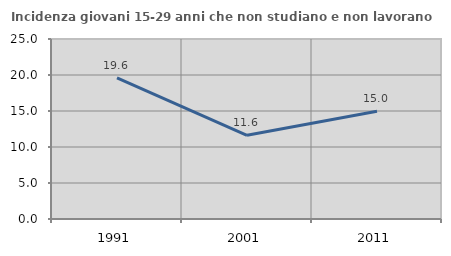
| Category | Incidenza giovani 15-29 anni che non studiano e non lavorano  |
|---|---|
| 1991.0 | 19.588 |
| 2001.0 | 11.621 |
| 2011.0 | 14.953 |